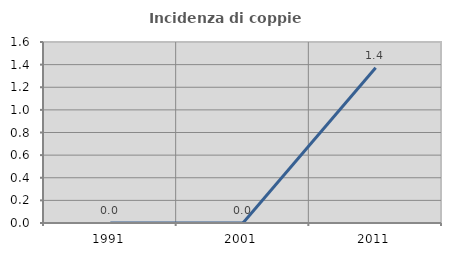
| Category | Incidenza di coppie miste |
|---|---|
| 1991.0 | 0 |
| 2001.0 | 0 |
| 2011.0 | 1.373 |